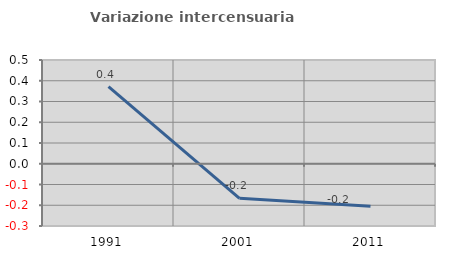
| Category | Variazione intercensuaria annua |
|---|---|
| 1991.0 | 0.372 |
| 2001.0 | -0.167 |
| 2011.0 | -0.205 |